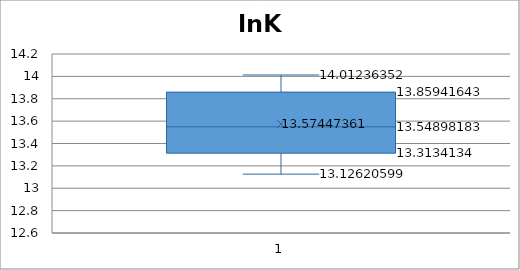
| Category | Residuals |
|---|---|
| 14.795673089222689 | -0.06 |
| 14.814190948390609 | -0.054 |
| 14.819969768492316 | -0.022 |
| 14.843279434500802 | -0.02 |
| 14.858759067750176 | 0.011 |
| 14.889434444462315 | 0.007 |
| 14.893465095117683 | 0.024 |
| 14.904834103764014 | 0.068 |
| 14.945517990074325 | 0.039 |
| 14.97674957794506 | 0.05 |
| 15.032960528209012 | 0.022 |
| 15.056896546931286 | 0.03 |
| 15.112923116846606 | 0.01 |
| 15.139258923814495 | 0.007 |
| 15.164344028675483 | -0.025 |
| 15.160699427309444 | -0.018 |
| 15.16834662747836 | -0.033 |
| 15.192053914873446 | -0.023 |
| 15.182936960251597 | 0.001 |
| 15.205410441681178 | -0.017 |
| 15.202823581821061 | -0.01 |
| 15.21218687956394 | 0 |
| 15.21308949217036 | 0.013 |